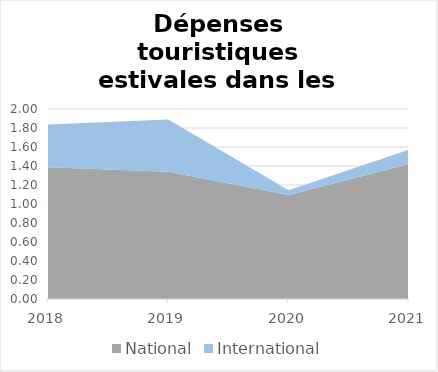
| Category | National | International |
|---|---|---|
| 2018.0 | 1.387 | 0.45 |
| 2019.0 | 1.341 | 0.55 |
| 2020.0 | 1.094 | 0.05 |
| 2021.0 | 1.421 | 0.15 |